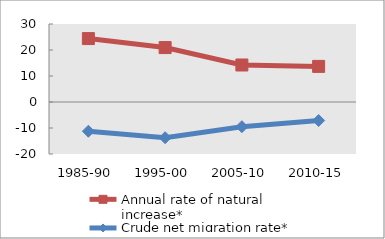
| Category | Annual rate of natural increase* | Crude net migration rate* |
|---|---|---|
| 1985-90 | 24.397 | -11.239 |
| 1995-00 | 20.93 | -13.727 |
| 2005-10 | 14.234 | -9.494 |
| 2010-15 | 13.692 | -7.118 |